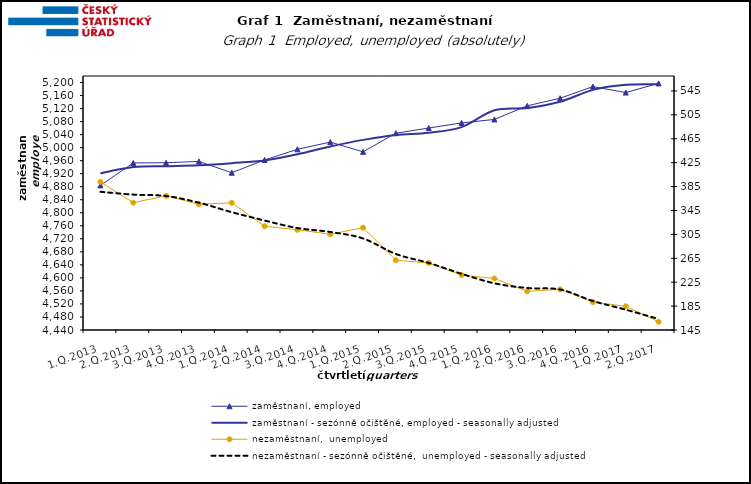
| Category | zaměstnaní, employed | zaměstnaní - sezónně očištěné, employed - seasonally adjusted |
|---|---|---|
| 1.Q.2013 | 4884.025 | 4921.298 |
| 2.Q.2013 | 4952.991 | 4940.38 |
| 3.Q.2013 | 4953.606 | 4943.118 |
| 4.Q.2013 | 4957.713 | 4946.225 |
| 1.Q.2014 | 4922.963 | 4952.405 |
| 2.Q.2014 | 4962.219 | 4960.65 |
| 3.Q.2014 | 4994.947 | 4979.618 |
| 4.Q.2014 | 5017.051 | 5003.629 |
| 1.Q.2015 | 4987.141 | 5023.827 |
| 2.Q.2015 | 5044.285 | 5038.984 |
| 3.Q.2015 | 5060.3 | 5045.647 |
| 4.Q.2015 | 5075.884 | 5063.085 |
| 1.Q.2016 | 5086.671 | 5114.698 |
| 2.Q.2016 | 5128.493 | 5121.602 |
| 3.Q.2016 | 5151.712 | 5140.967 |
| 4.Q.2016 | 5187.436 | 5177.35 |
| 1.Q.2017 | 5169.203 | 5192.941 |
| 2.Q.2017 | 5197.265 | 5194.555 |